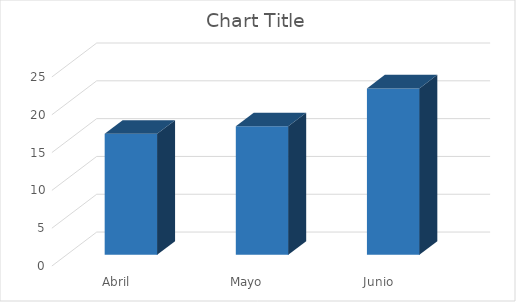
| Category | Series 0 |
|---|---|
| Abril | 16 |
| Mayo | 17 |
| Junio | 22 |